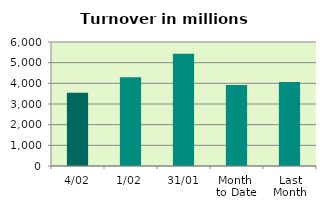
| Category | Series 0 |
|---|---|
| 4/02 | 3547.48 |
| 1/02 | 4291.157 |
| 31/01 | 5427.821 |
| Month 
to Date | 3919.318 |
| Last
Month | 4067.116 |